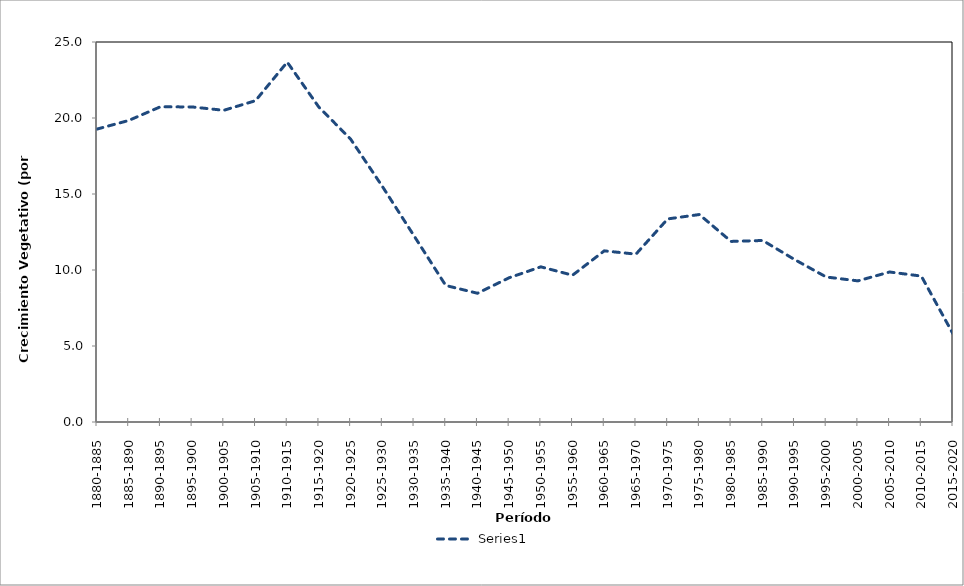
| Category | Series 2 |
|---|---|
| 1880-1885 | 19.271 |
| 1885-1890 | 19.837 |
| 1890-1895 | 20.739 |
| 1895-1900 | 20.727 |
| 1900-1905 | 20.506 |
| 1905-1910 | 21.139 |
| 1910-1915 | 23.677 |
| 1915-1920 | 20.711 |
| 1920-1925 | 18.612 |
| 1925-1930 | 15.502 |
| 1930-1935 | 12.247 |
| 1935-1940 | 8.982 |
| 1940-1945 | 8.47 |
| 1945-1950 | 9.489 |
| 1950-1955 | 10.208 |
| 1955-1960 | 9.657 |
| 1960-1965 | 11.259 |
| 1965-1970 | 11.043 |
| 1970-1975 | 13.36 |
| 1975-1980 | 13.649 |
| 1980-1985 | 11.88 |
| 1985-1990 | 11.942 |
| 1990-1995 | 10.691 |
| 1995-2000 | 9.54 |
| 2000-2005 | 9.284 |
| 2005-2010 | 9.868 |
| 2010-2015 | 9.6 |
| 2015-2020 | 5.8 |